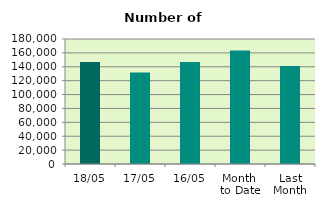
| Category | Series 0 |
|---|---|
| 18/05 | 146796 |
| 17/05 | 131806 |
| 16/05 | 147042 |
| Month 
to Date | 163538.308 |
| Last
Month | 140978.316 |